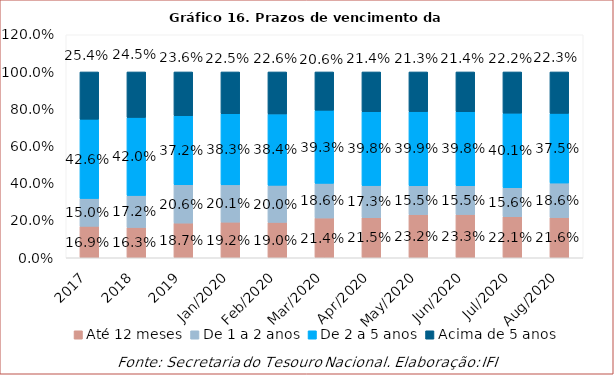
| Category | Até 12 meses | De 1 a 2 anos | De 2 a 5 anos | Acima de 5 anos |
|---|---|---|---|---|
| 2017.0 | 0.169 | 0.15 | 0.426 | 0.254 |
| 2018.0 | 0.163 | 0.172 | 0.42 | 0.245 |
| 2019.0 | 0.187 | 0.206 | 0.372 | 0.236 |
| 43831.0 | 0.192 | 0.201 | 0.383 | 0.225 |
| 43862.0 | 0.19 | 0.2 | 0.384 | 0.226 |
| 43891.0 | 0.214 | 0.186 | 0.393 | 0.206 |
| 43922.0 | 0.215 | 0.173 | 0.398 | 0.214 |
| 43952.0 | 0.232 | 0.155 | 0.399 | 0.213 |
| 43983.0 | 0.233 | 0.155 | 0.398 | 0.214 |
| 44013.0 | 0.221 | 0.156 | 0.401 | 0.222 |
| 44044.0 | 0.216 | 0.186 | 0.375 | 0.223 |